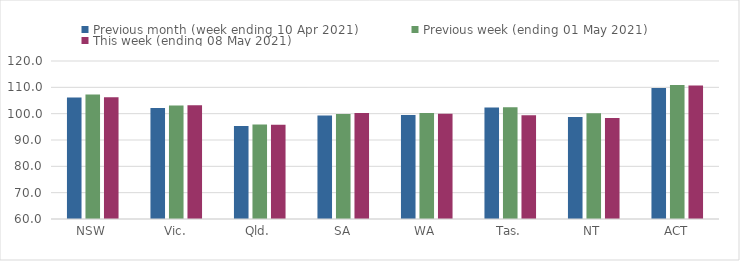
| Category | Previous month (week ending 10 Apr 2021) | Previous week (ending 01 May 2021) | This week (ending 08 May 2021) |
|---|---|---|---|
| NSW | 106.13 | 107.29 | 106.24 |
| Vic. | 102.16 | 103.12 | 103.2 |
| Qld. | 95.29 | 95.87 | 95.79 |
| SA | 99.29 | 99.84 | 100.29 |
| WA | 99.51 | 100.27 | 99.93 |
| Tas. | 102.34 | 102.42 | 99.44 |
| NT | 98.77 | 100.15 | 98.39 |
| ACT | 109.7 | 110.91 | 110.65 |